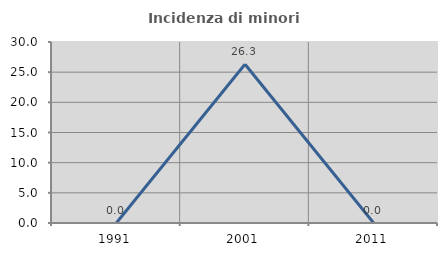
| Category | Incidenza di minori stranieri |
|---|---|
| 1991.0 | 0 |
| 2001.0 | 26.316 |
| 2011.0 | 0 |